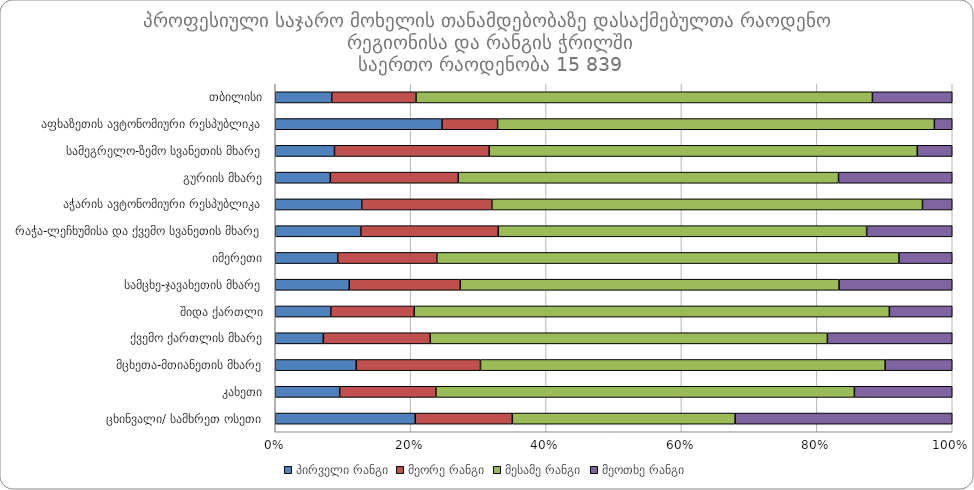
| Category |  პირველი რანგი |  მეორე რანგი |  მესამე რანგი |  მეოთხე რანგი |
|---|---|---|---|---|
|  თბილისი | 650 | 971 | 5255 | 919 |
|  აფხაზეთის ავტონომიური რესპუბლიკა | 84 | 28 | 220 | 9 |
|  სამეგრელო-ზემო სვანეთის მხარე | 88 | 230 | 636 | 52 |
|  გურიის მხარე | 31 | 72 | 214 | 64 |
|  აჭარის ავტონომიური რესპუბლიკა | 157 | 236 | 781 | 54 |
|  რაჭა-ლეჩხუმისა და ქვემო სვანეთის მხარე | 43 | 69 | 185 | 43 |
|  იმერეთი | 116 | 184 | 858 | 99 |
|  სამცხე-ჯავახეთის მხარე | 66 | 99 | 338 | 101 |
|  შიდა ქართლი | 38 | 57 | 325 | 43 |
|  ქვემო ქართლის მხარე | 72 | 160 | 595 | 187 |
|  მცხეთა-მთიანეთის მხარე | 41 | 63 | 205 | 34 |
|  კახეთი | 79 | 118 | 513 | 120 |
|  ცხინვალი/ სამხრეთ ოსეთი | 49 | 34 | 78 | 76 |